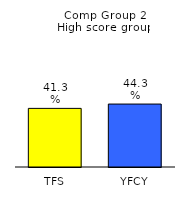
| Category | Series 0 |
|---|---|
| TFS | 0.413 |
| YFCY | 0.443 |